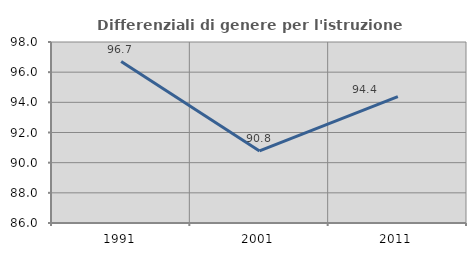
| Category | Differenziali di genere per l'istruzione superiore |
|---|---|
| 1991.0 | 96.704 |
| 2001.0 | 90.775 |
| 2011.0 | 94.375 |